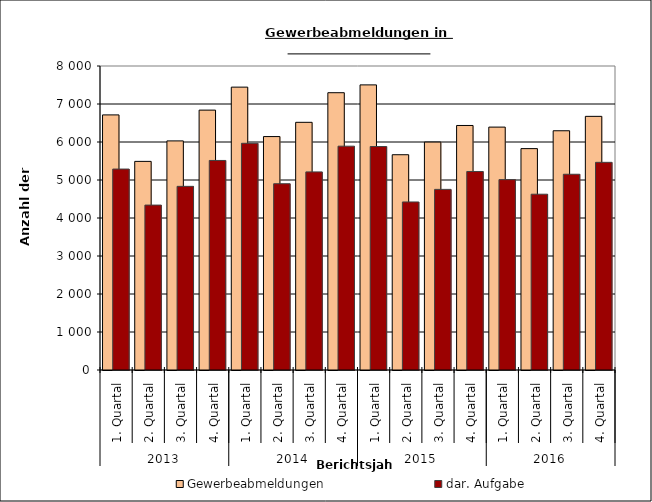
| Category | Gewerbeabmeldungen | dar. Aufgabe |
|---|---|---|
| 0 | 6713 | 5288 |
| 1 | 5490 | 4340 |
| 2 | 6029 | 4833 |
| 3 | 6839 | 5514 |
| 4 | 7444 | 5966 |
| 5 | 6143 | 4902 |
| 6 | 6518 | 5213 |
| 7 | 7297 | 5890 |
| 8 | 7503 | 5881 |
| 9 | 5665 | 4422 |
| 10 | 5998 | 4753 |
| 11 | 6435 | 5224 |
| 12 | 6392 | 5010 |
| 13 | 5826 | 4626 |
| 14 | 6296 | 5151 |
| 15 | 6675 | 5465 |